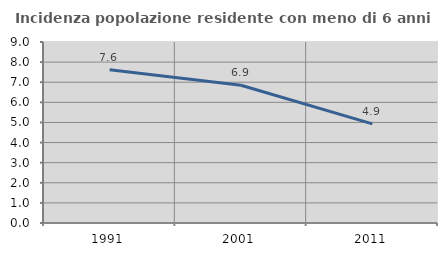
| Category | Incidenza popolazione residente con meno di 6 anni |
|---|---|
| 1991.0 | 7.62 |
| 2001.0 | 6.85 |
| 2011.0 | 4.93 |